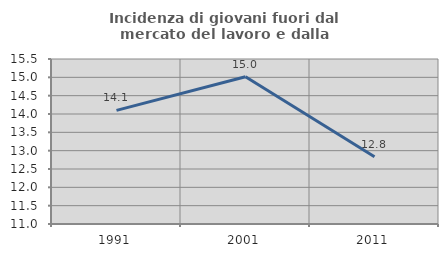
| Category | Incidenza di giovani fuori dal mercato del lavoro e dalla formazione  |
|---|---|
| 1991.0 | 14.099 |
| 2001.0 | 15.016 |
| 2011.0 | 12.832 |